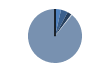
| Category | Series 0 |
|---|---|
| ARRASTRE | 38 |
| CERCO | 44 |
| PALANGRE | 27 |
| REDES DE ENMALLE | 4 |
| ARTES FIJAS | 2 |
| ARTES MENORES | 938 |
| SIN TIPO ASIGNADO | 0 |